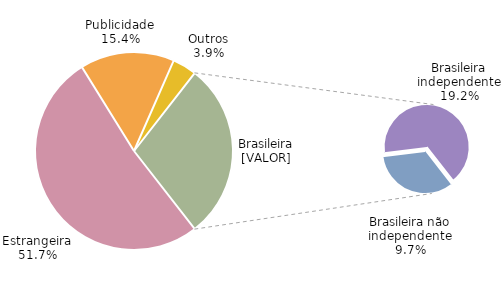
| Category | Series 0 |
|---|---|
| Estrangeira | 0.517 |
| Publicidade | 0.154 |
| Outros | 0.039 |
| Brasileira não independente | 0.097 |
| Brasileira independente | 0.192 |